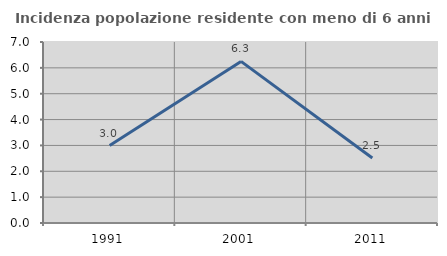
| Category | Incidenza popolazione residente con meno di 6 anni |
|---|---|
| 1991.0 | 2.994 |
| 2001.0 | 6.25 |
| 2011.0 | 2.516 |